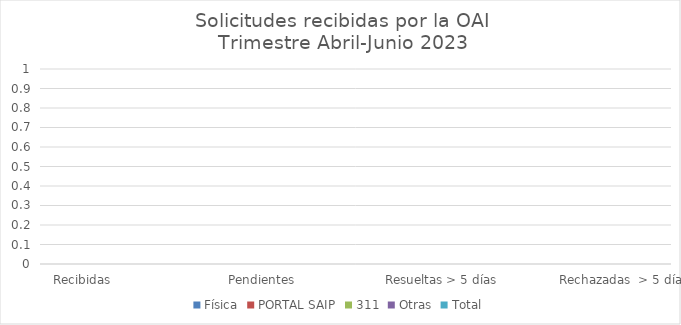
| Category | Física | PORTAL SAIP | 311 | Otras | Total |
|---|---|---|---|---|---|
| Recibidas  | 0 | 0 | 0 | 0 | 0 |
| Cambiadas a otra institución | 0 | 0 | 0 | 0 | 0 |
| Pendientes  | 0 | 0 | 0 | 0 | 0 |
| Resueltas < 5 días | 0 | 0 | 0 | 0 | 0 |
| Resueltas > 5 días  | 0 | 0 | 0 | 0 | 0 |
| Rechazadas  < 5 días | 0 | 0 | 0 | 0 | 0 |
| Rechazadas  > 5 días | 0 | 0 | 0 | 0 | 0 |